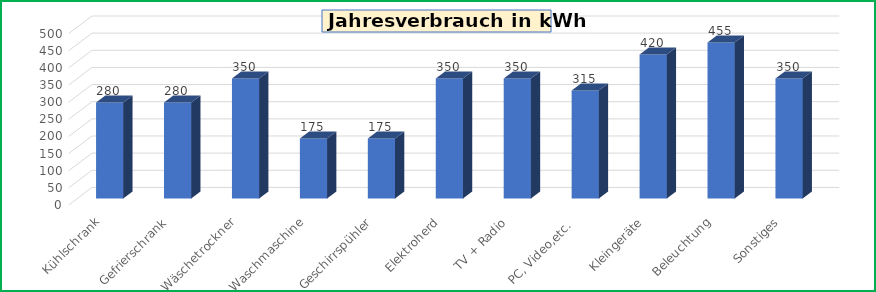
| Category |  kWh |
|---|---|
| Kühlschrank | 280 |
| Gefrierschrank | 280 |
| Wäschetrockner | 350 |
| Waschmaschine | 175 |
| Geschirrspühler | 175 |
| Elektroherd | 350 |
| TV + Radio | 350 |
| PC, Video,etc.  | 315 |
| Kleingeräte | 420 |
| Beleuchtung | 455 |
| Sonstiges | 350 |